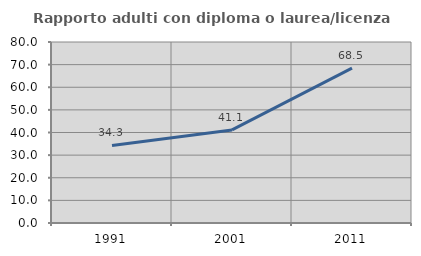
| Category | Rapporto adulti con diploma o laurea/licenza media  |
|---|---|
| 1991.0 | 34.274 |
| 2001.0 | 41.137 |
| 2011.0 | 68.459 |